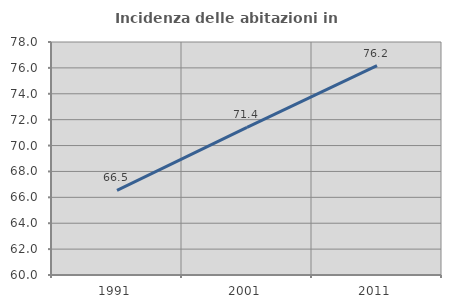
| Category | Incidenza delle abitazioni in proprietà  |
|---|---|
| 1991.0 | 66.534 |
| 2001.0 | 71.397 |
| 2011.0 | 76.174 |